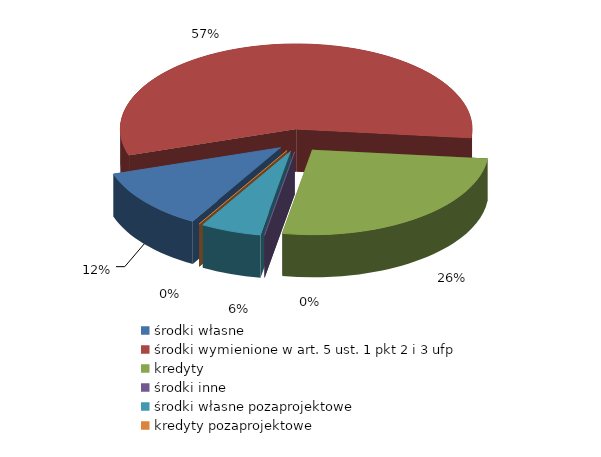
| Category | Series 0 |
|---|---|
| środki własne | 14672333.46 |
| środki wymienione w art. 5 ust. 1 pkt 2 i 3 ufp | 71413836.73 |
| kredyty | 32871257.28 |
| środki inne | 5723.22 |
| środki własne pozaprojektowe | 7034377.57 |
| kredyty pozaprojektowe | 0 |